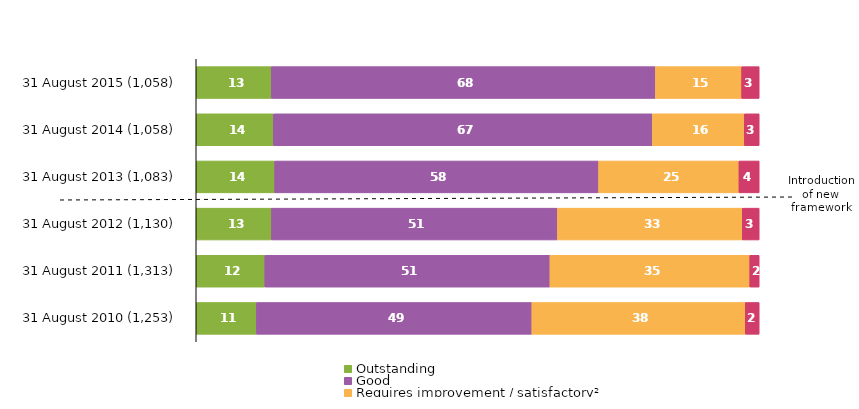
| Category | Outstanding | Good | Requires improvement / satisfactory² | Inadequate |
|---|---|---|---|---|
| 31 August 2015 (1,058) | 13.327 | 68.242 | 15.312 | 3.119 |
| 31 August 2014 (1,058) | 13.705 | 67.297 | 16.352 | 2.647 |
| 31 August 2013 (1,083) | 13.943 | 57.525 | 24.931 | 3.601 |
| 31 August 2012 (1,130) | 13.363 | 50.796 | 32.832 | 3.009 |
| 31 August 2011 (1,313) | 12.186 | 50.647 | 35.491 | 1.676 |
| 31 August 2010 (1,253) | 10.694 | 48.923 | 37.909 | 2.474 |